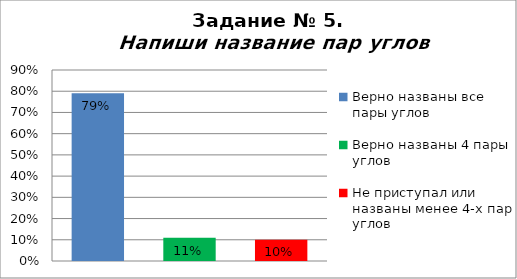
| Category | Напиши название пар углов |
|---|---|
| Верно названы все пары углов | 0.79 |
| Верно названы 4 пары углов | 0.11 |
| Не приступал или названы менее 4-х пар углов | 0.1 |